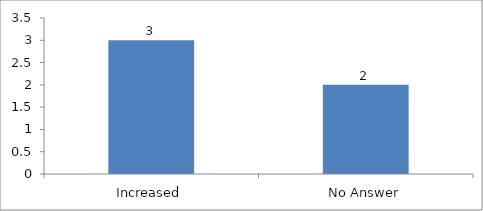
| Category | If no, should it be reduced or increased |
|---|---|
| Increased | 3 |
| No Answer | 2 |